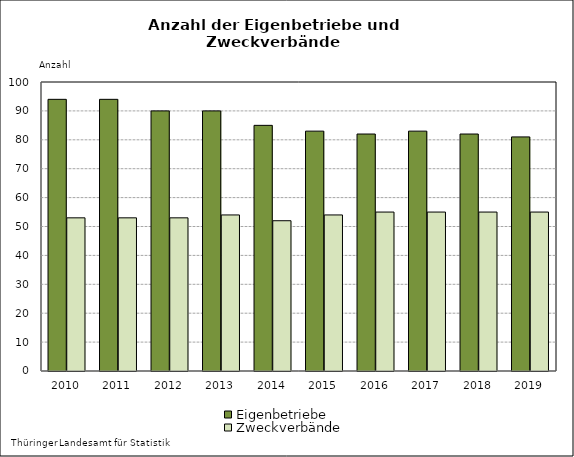
| Category | Eigenbetriebe | Zweckverbände |
|---|---|---|
| 2010.0 | 94 | 53 |
| 2011.0 | 94 | 53 |
| 2012.0 | 90 | 53 |
| 2013.0 | 90 | 54 |
| 2014.0 | 85 | 52 |
| 2015.0 | 83 | 54 |
| 2016.0 | 82 | 55 |
| 2017.0 | 83 | 55 |
| 2018.0 | 82 | 55 |
| 2019.0 | 81 | 55 |